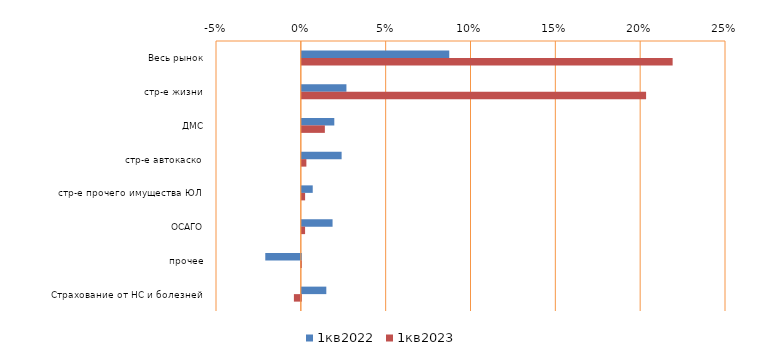
| Category | 1кв2022 | 1кв2023 |
|---|---|---|
| Весь рынок | 0.087 | 0.219 |
| стр-е жизни | 0.026 | 0.203 |
| ДМС | 0.019 | 0.014 |
| стр-е автокаско | 0.023 | 0.003 |
| стр-е прочего имущества ЮЛ | 0.006 | 0.002 |
| ОСАГО | 0.018 | 0.002 |
| прочее | -0.021 | 0 |
| Страхование от НС и болезней | 0.014 | -0.004 |